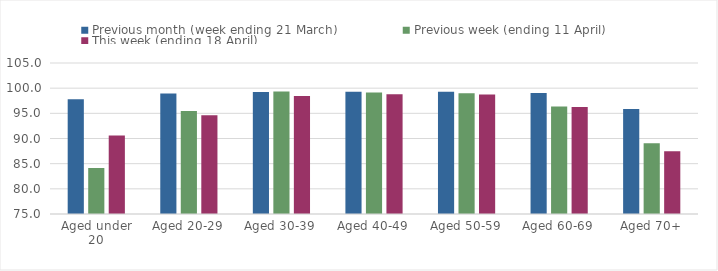
| Category | Previous month (week ending 21 March) | Previous week (ending 11 April) | This week (ending 18 April) |
|---|---|---|---|
| Aged under 20 | 97.797 | 84.138 | 90.62 |
| Aged 20-29 | 98.923 | 95.487 | 94.614 |
| Aged 30-39 | 99.228 | 99.361 | 98.466 |
| Aged 40-49 | 99.271 | 99.144 | 98.796 |
| Aged 50-59 | 99.289 | 99.002 | 98.75 |
| Aged 60-69 | 99.028 | 96.38 | 96.265 |
| Aged 70+ | 95.875 | 89.065 | 87.448 |